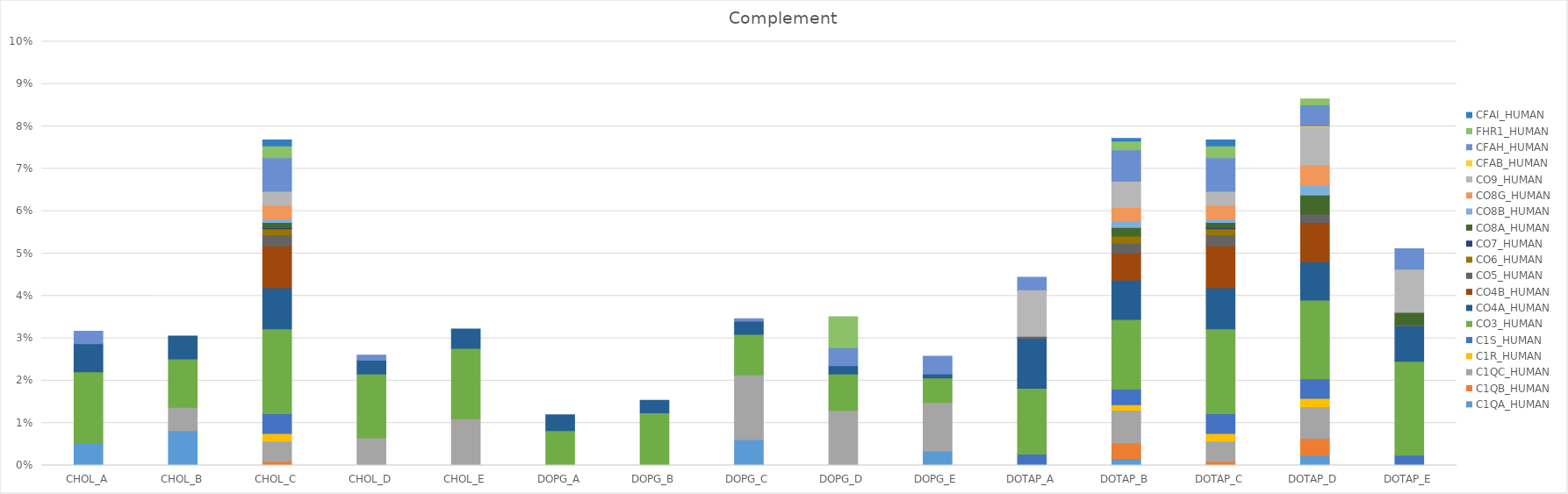
| Category | C1QA_HUMAN | C1QB_HUMAN | C1QC_HUMAN | C1R_HUMAN | C1S_HUMAN | CO3_HUMAN | CO4A_HUMAN | CO4B_HUMAN | CO5_HUMAN | CO6_HUMAN | CO7_HUMAN | CO8A_HUMAN | CO8B_HUMAN | CO8G_HUMAN | CO9_HUMAN | CFAB_HUMAN | CFAH_HUMAN | FHR1_HUMAN | CFAI_HUMAN |
|---|---|---|---|---|---|---|---|---|---|---|---|---|---|---|---|---|---|---|---|
| CHOL_A | 0.005 | 0 | 0 | 0 | 0 | 0.017 | 0.007 | 0 | 0 | 0 | 0 | 0 | 0 | 0 | 0 | 0 | 0.003 | 0 | 0 |
| CHOL_B | 0.008 | 0 | 0.005 | 0 | 0 | 0.011 | 0.005 | 0 | 0 | 0 | 0 | 0 | 0 | 0 | 0 | 0 | 0 | 0 | 0 |
| CHOL_C | 0 | 0.001 | 0.005 | 0.002 | 0.005 | 0.02 | 0.01 | 0.01 | 0.003 | 0.001 | 0 | 0.001 | 0.001 | 0.003 | 0.003 | 0 | 0.008 | 0.003 | 0.001 |
| CHOL_D | 0 | 0 | 0.007 | 0 | 0 | 0.015 | 0.003 | 0 | 0 | 0 | 0 | 0 | 0 | 0 | 0 | 0 | 0.001 | 0 | 0 |
| CHOL_E | 0 | 0 | 0.011 | 0 | 0 | 0.017 | 0.005 | 0 | 0 | 0 | 0 | 0 | 0 | 0 | 0 | 0 | 0 | 0 | 0 |
| DOPG_A | 0 | 0 | 0 | 0 | 0 | 0.008 | 0.004 | 0 | 0 | 0 | 0 | 0 | 0 | 0 | 0 | 0 | 0 | 0 | 0 |
| DOPG_B | 0 | 0 | 0 | 0 | 0 | 0.012 | 0.003 | 0 | 0 | 0 | 0 | 0 | 0 | 0 | 0 | 0 | 0 | 0 | 0 |
| DOPG_C | 0.006 | 0 | 0.015 | 0 | 0 | 0.01 | 0.003 | 0 | 0 | 0 | 0 | 0 | 0 | 0 | 0 | 0 | 0.001 | 0 | 0 |
| DOPG_D | 0 | 0 | 0.013 | 0 | 0 | 0.009 | 0.002 | 0 | 0 | 0 | 0 | 0 | 0 | 0 | 0 | 0 | 0.004 | 0.007 | 0 |
| DOPG_E | 0.003 | 0 | 0.011 | 0 | 0 | 0.006 | 0.001 | 0 | 0 | 0 | 0 | 0 | 0 | 0 | 0 | 0 | 0.004 | 0 | 0 |
| DOTAP_A | 0 | 0 | 0 | 0 | 0.003 | 0.016 | 0.012 | 0 | 0.001 | 0 | 0 | 0 | 0 | 0 | 0.011 | 0 | 0.003 | 0 | 0 |
| DOTAP_B | 0.002 | 0.004 | 0.008 | 0.001 | 0.004 | 0.016 | 0.009 | 0.006 | 0.002 | 0.002 | 0 | 0.002 | 0.001 | 0.003 | 0.006 | 0 | 0.007 | 0.002 | 0.001 |
| DOTAP_C | 0 | 0.001 | 0.005 | 0.002 | 0.005 | 0.02 | 0.01 | 0.01 | 0.003 | 0.001 | 0 | 0.001 | 0.001 | 0.003 | 0.003 | 0 | 0.008 | 0.003 | 0.001 |
| DOTAP_D | 0.002 | 0.004 | 0.007 | 0.002 | 0.005 | 0.019 | 0.009 | 0.009 | 0.002 | 0 | 0 | 0.005 | 0.002 | 0.005 | 0.009 | 0 | 0.005 | 0.001 | 0 |
| DOTAP_E | 0 | 0 | 0 | 0 | 0.002 | 0.022 | 0.008 | 0 | 0 | 0 | 0 | 0.003 | 0 | 0 | 0.01 | 0 | 0.005 | 0 | 0 |